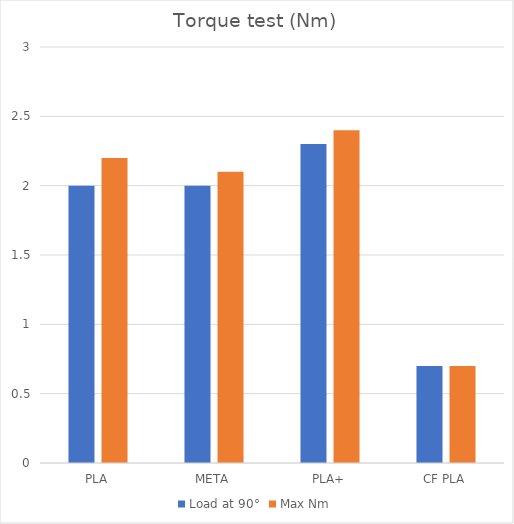
| Category | Load at 90° | Max Nm |
|---|---|---|
| PLA | 2 | 2.2 |
| META | 2 | 2.1 |
| PLA+ | 2.3 | 2.4 |
| CF PLA | 0.7 | 0.7 |